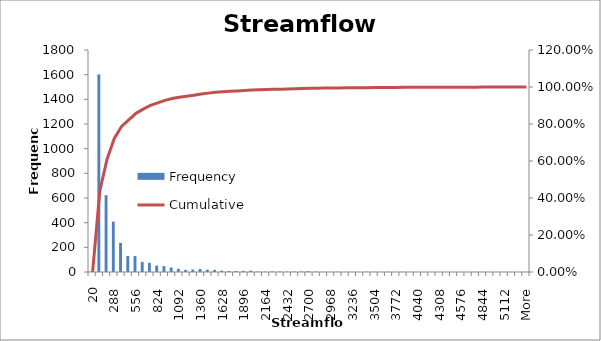
| Category | Frequency |
|---|---|
| 20 | 4 |
| 109.3333333 | 1602 |
| 198.6666667 | 623 |
| 288 | 408 |
| 377.3333333 | 236 |
| 466.6666667 | 130 |
| 556 | 129 |
| 645.3333333 | 82 |
| 734.6666667 | 74 |
| 824 | 52 |
| 913.3333333 | 48 |
| 1002.666667 | 37 |
| 1092 | 26 |
| 1181.333333 | 17 |
| 1270.666667 | 20 |
| 1360 | 24 |
| 1449.333333 | 19 |
| 1538.666667 | 17 |
| 1628 | 11 |
| 1717.333333 | 8 |
| 1806.666667 | 8 |
| 1896 | 9 |
| 1985.333333 | 11 |
| 2074.666667 | 4 |
| 2164 | 2 |
| 2253.333333 | 5 |
| 2342.666667 | 3 |
| 2432 | 3 |
| 2521.333333 | 4 |
| 2610.666667 | 4 |
| 2700 | 6 |
| 2789.333333 | 3 |
| 2878.666667 | 2 |
| 2968 | 1 |
| 3057.333333 | 2 |
| 3146.666667 | 1 |
| 3236 | 1 |
| 3325.333333 | 1 |
| 3414.666667 | 2 |
| 3504 | 2 |
| 3593.333333 | 1 |
| 3682.666667 | 2 |
| 3772 | 0 |
| 3861.333333 | 2 |
| 3950.666667 | 1 |
| 4040 | 0 |
| 4129.333333 | 0 |
| 4218.666667 | 0 |
| 4308 | 0 |
| 4397.333333 | 0 |
| 4486.666667 | 0 |
| 4576 | 0 |
| 4665.333333 | 0 |
| 4754.666667 | 2 |
| 4844 | 1 |
| 4933.333333 | 0 |
| 5022.666667 | 0 |
| 5112 | 1 |
| 5201.333333 | 0 |
| 5290.666667 | 0 |
| More | 1 |